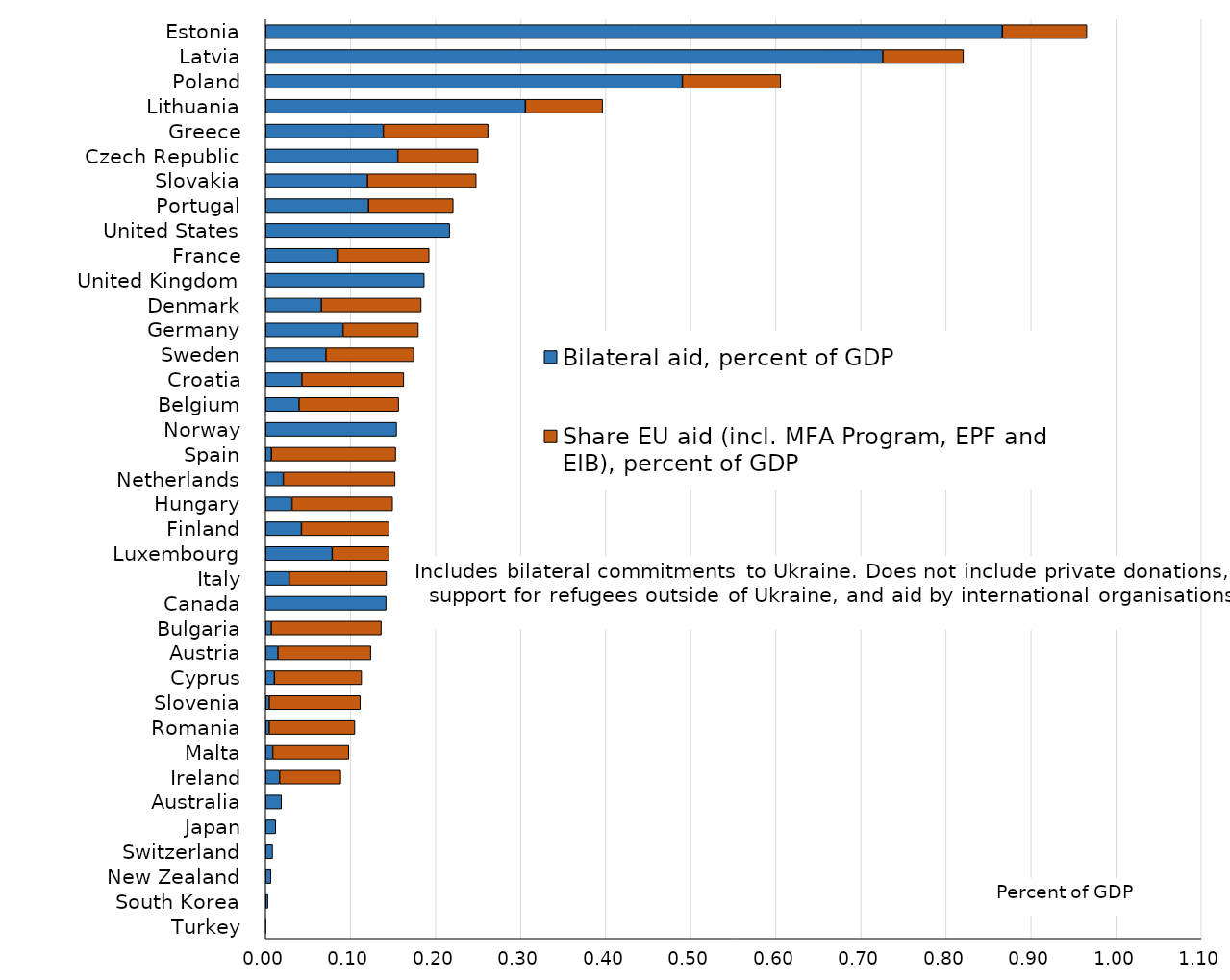
| Category | Bilateral aid, percent of GDP | Share EU aid (incl. MFA Program, EPF and EIB), percent of GDP |
|---|---|---|
| Estonia | 0.866 | 0.099 |
| Latvia | 0.725 | 0.095 |
| Poland | 0.49 | 0.116 |
| Lithuania | 0.305 | 0.091 |
| Greece | 0.138 | 0.123 |
| Czech Republic | 0.155 | 0.094 |
| Slovakia | 0.12 | 0.128 |
| Portugal | 0.121 | 0.1 |
| United States | 0.216 | 0 |
| France | 0.084 | 0.108 |
| United Kingdom | 0.186 | 0 |
| Denmark | 0.065 | 0.117 |
| Germany | 0.091 | 0.089 |
| Sweden | 0.071 | 0.103 |
| Croatia | 0.042 | 0.12 |
| Belgium | 0.039 | 0.117 |
| Norway | 0.154 | 0 |
| Spain | 0.007 | 0.146 |
| Netherlands | 0.021 | 0.131 |
| Hungary | 0.031 | 0.118 |
| Finland | 0.042 | 0.103 |
| Luxembourg | 0.078 | 0.067 |
| Italy | 0.028 | 0.114 |
| Canada | 0.142 | 0 |
| Bulgaria | 0.007 | 0.13 |
| Austria | 0.014 | 0.109 |
| Cyprus | 0.01 | 0.103 |
| Slovenia | 0.004 | 0.107 |
| Romania | 0.004 | 0.101 |
| Malta | 0.008 | 0.089 |
| Ireland | 0.016 | 0.072 |
| Australia | 0.019 | 0 |
| Japan | 0.012 | 0 |
| Switzerland | 0.008 | 0 |
| New Zealand | 0.006 | 0 |
| South Korea | 0.003 | 0 |
| Turkey | 0 | 0 |